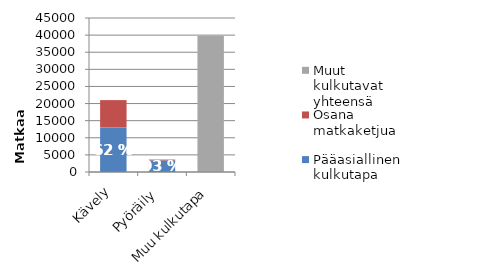
| Category | Pääasiallinen kulkutapa | Osana matkaketjua | Muut kulkutavat yhteensä |
|---|---|---|---|
| Kävely | 13025 | 7982 | 0 |
| Pyöräily  | 3386 | 245 | 0 |
| Muu kulkutapa | 0 | 0 | 39834 |